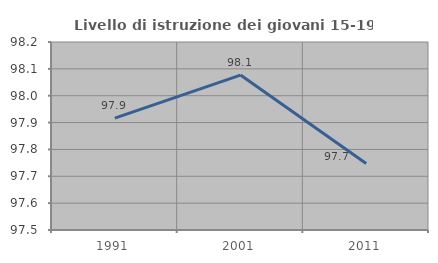
| Category | Livello di istruzione dei giovani 15-19 anni |
|---|---|
| 1991.0 | 97.917 |
| 2001.0 | 98.077 |
| 2011.0 | 97.748 |